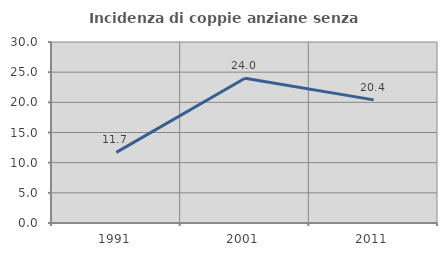
| Category | Incidenza di coppie anziane senza figli  |
|---|---|
| 1991.0 | 11.702 |
| 2001.0 | 24 |
| 2011.0 | 20.408 |